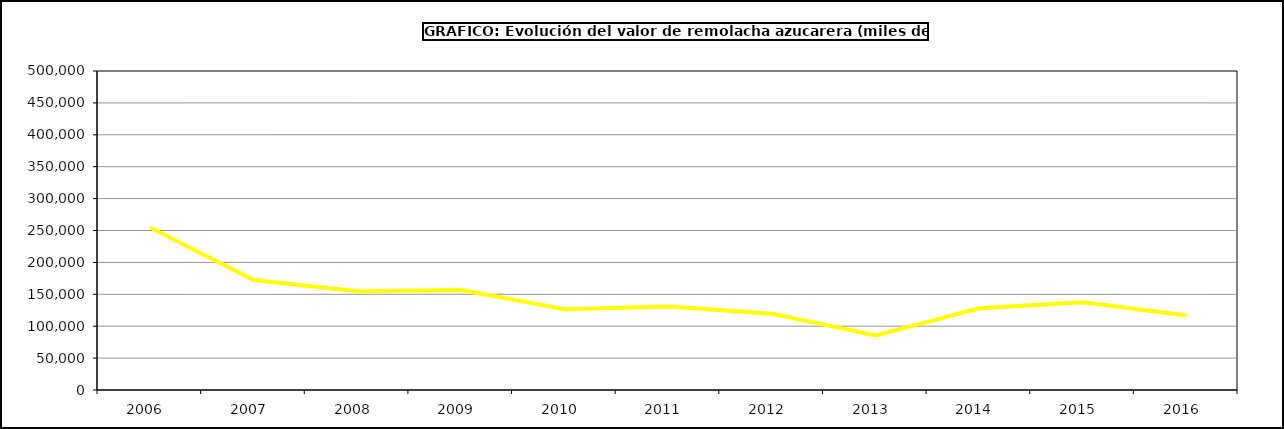
| Category | Valor |
|---|---|
| 2006.0 | 254641.255 |
| 2007.0 | 172339.526 |
| 2008.0 | 154723.398 |
| 2009.0 | 156763.564 |
| 2010.0 | 126535.709 |
| 2011.0 | 130682.292 |
| 2012.0 | 119377.935 |
| 2013.0 | 85662.388 |
| 2014.0 | 128081.83 |
| 2015.0 | 137355 |
| 2016.0 | 116654 |